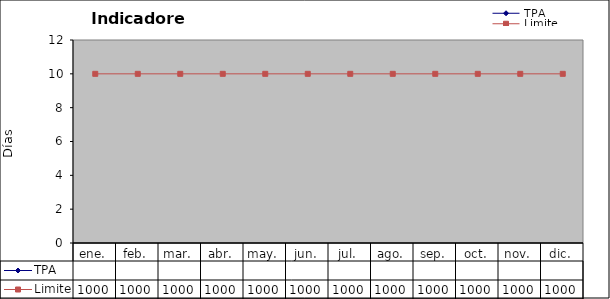
| Category | TPA  | Limite |
|---|---|---|
| ene. |  | 10 |
| feb. |  | 10 |
| mar. |  | 10 |
| abr. |  | 10 |
| may. |  | 10 |
| jun. |  | 10 |
| jul. |  | 10 |
| ago. |  | 10 |
| sep. |  | 10 |
| oct. |  | 10 |
| nov. |  | 10 |
| dic. |  | 10 |